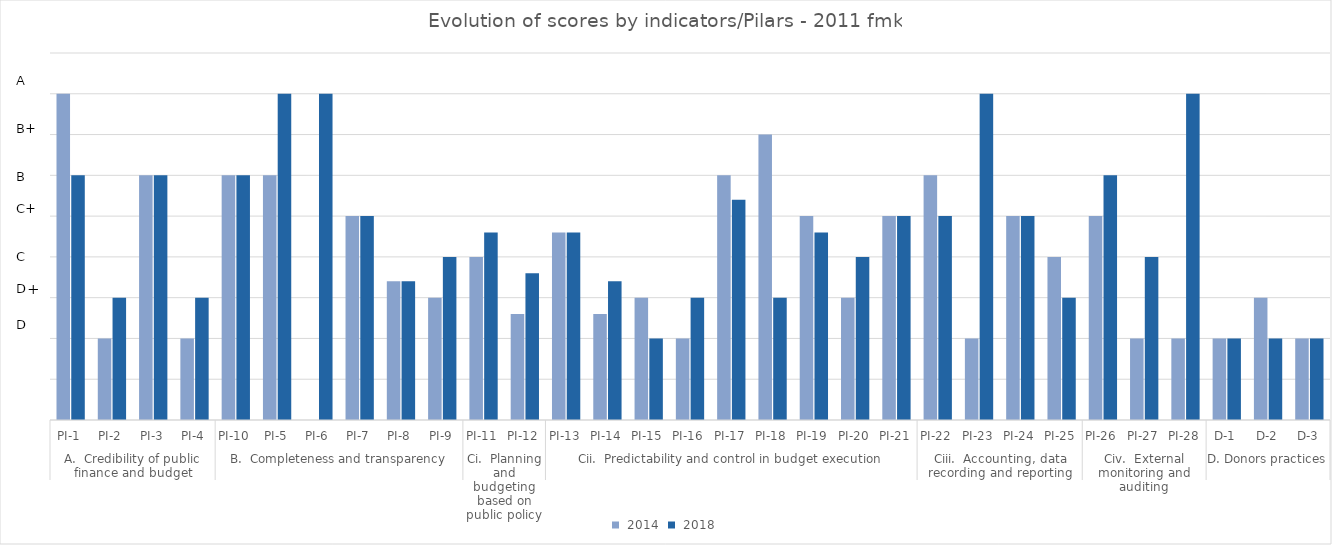
| Category |  2014 |  2018 |
|---|---|---|
| 0 | 4 | 3 |
| 1 | 1 | 1.5 |
| 2 | 3 | 3 |
| 3 | 1 | 1.5 |
| 4 | 3 | 3 |
| 5 | 3 | 4 |
| 6 | 0 | 4 |
| 7 | 2.5 | 2.5 |
| 8 | 1.7 | 1.7 |
| 9 | 1.5 | 2 |
| 10 | 2 | 2.3 |
| 11 | 1.3 | 1.8 |
| 12 | 2.3 | 2.3 |
| 13 | 1.3 | 1.7 |
| 14 | 1.5 | 1 |
| 15 | 1 | 1.5 |
| 16 | 3 | 2.7 |
| 17 | 3.5 | 1.5 |
| 18 | 2.5 | 2.3 |
| 19 | 1.5 | 2 |
| 20 | 2.5 | 2.5 |
| 21 | 3 | 2.5 |
| 22 | 1 | 4 |
| 23 | 2.5 | 2.5 |
| 24 | 2 | 1.5 |
| 25 | 2.5 | 3 |
| 26 | 1 | 2 |
| 27 | 1 | 4 |
| 28 | 1 | 1 |
| 29 | 1.5 | 1 |
| 30 | 1 | 1 |